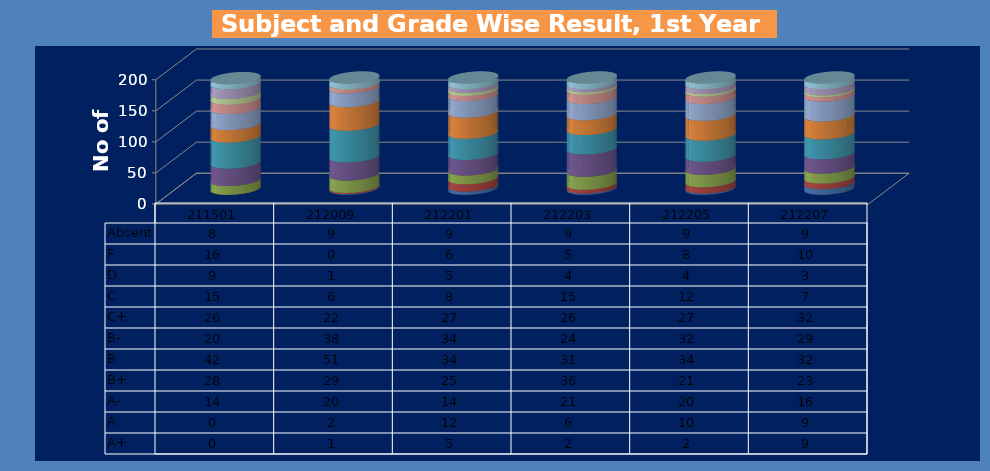
| Category | A+ | A | A- | B+ | B | B- | C+ | C | D | F | Absent |
|---|---|---|---|---|---|---|---|---|---|---|---|
| 211501.0 | 0 | 0 | 14 | 28 | 42 | 20 | 26 | 15 | 9 | 16 | 8 |
| 212009.0 | 1 | 2 | 20 | 29 | 51 | 38 | 22 | 6 | 1 | 0 | 9 |
| 212201.0 | 5 | 12 | 14 | 25 | 34 | 34 | 27 | 8 | 5 | 6 | 9 |
| 212203.0 | 2 | 6 | 21 | 36 | 31 | 24 | 26 | 15 | 4 | 5 | 9 |
| 212205.0 | 2 | 10 | 20 | 21 | 34 | 32 | 27 | 12 | 4 | 8 | 9 |
| 212207.0 | 9 | 9 | 16 | 23 | 32 | 29 | 32 | 7 | 3 | 10 | 9 |